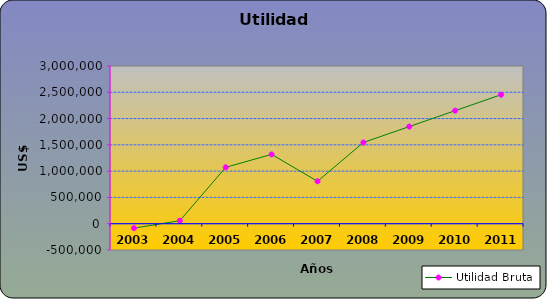
| Category | Utilidad Bruta |
|---|---|
| 2003.0 | -83918 |
| 2004.0 | 57498.3 |
| 2005.0 | 1072976.75 |
| 2006.0 | 1318494.55 |
| 2007.0 | 807400 |
| 2008.0 | 1544783.995 |
| 2009.0 | 1847749.22 |
| 2010.0 | 2150714.445 |
| 2011.0 | 2453679.67 |